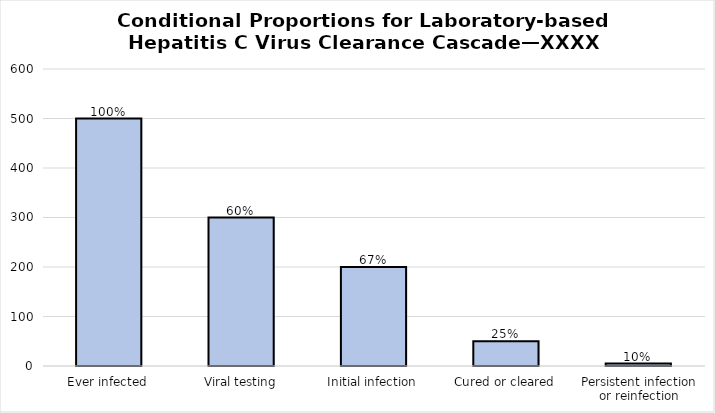
| Category | Series 0 |
|---|---|
| Ever infected | 500 |
| Viral testing | 300 |
| Initial infection | 200 |
| Cured or cleared | 50 |
| Persistent infection or reinfection | 5 |